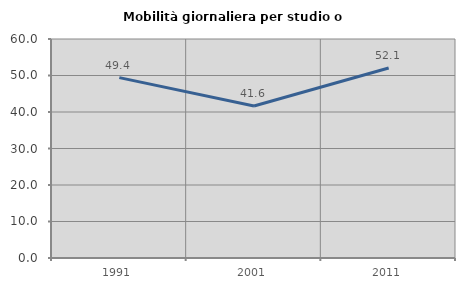
| Category | Mobilità giornaliera per studio o lavoro |
|---|---|
| 1991.0 | 49.424 |
| 2001.0 | 41.646 |
| 2011.0 | 52.073 |